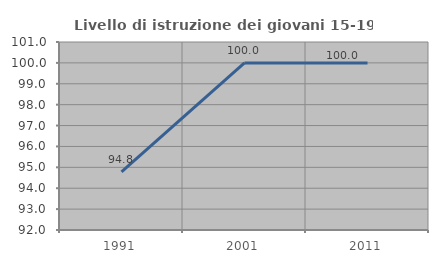
| Category | Livello di istruzione dei giovani 15-19 anni |
|---|---|
| 1991.0 | 94.783 |
| 2001.0 | 100 |
| 2011.0 | 100 |